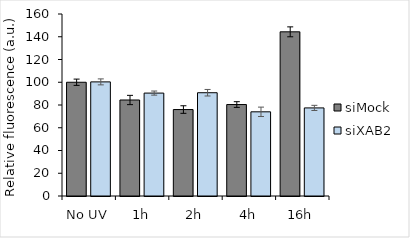
| Category | siMock | siXAB2 |
|---|---|---|
| No UV | 100 | 100.322 |
| 1h | 84.403 | 90.481 |
| 2h | 76.002 | 90.787 |
| 4h | 80.406 | 74.003 |
| 16h | 144.331 | 77.433 |